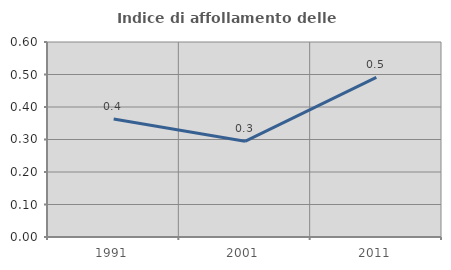
| Category | Indice di affollamento delle abitazioni  |
|---|---|
| 1991.0 | 0.363 |
| 2001.0 | 0.294 |
| 2011.0 | 0.491 |